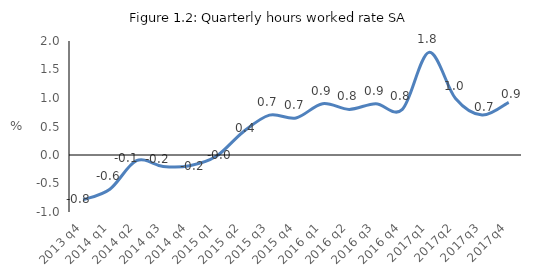
| Category | Series 0 |
|---|---|
| 2013 q4 | -0.785 |
| 2014 q1 | -0.6 |
| 2014 q2 | -0.1 |
| 2014 q3 | -0.2 |
| 2014 q4 | -0.189 |
| 2015 q1 | -0.023 |
| 2015 q2 | 0.4 |
| 2015 q3 | 0.7 |
| 2015 q4 | 0.65 |
| 2016 q1 | 0.9 |
| 2016 q2 | 0.8 |
| 2016 q3 | 0.9 |
| 2016 q4 | 0.8 |
| 2017q1 | 1.8 |
| 2017q2 | 0.991 |
| 2017q3 | 0.7 |
| 2017q4 | 0.925 |